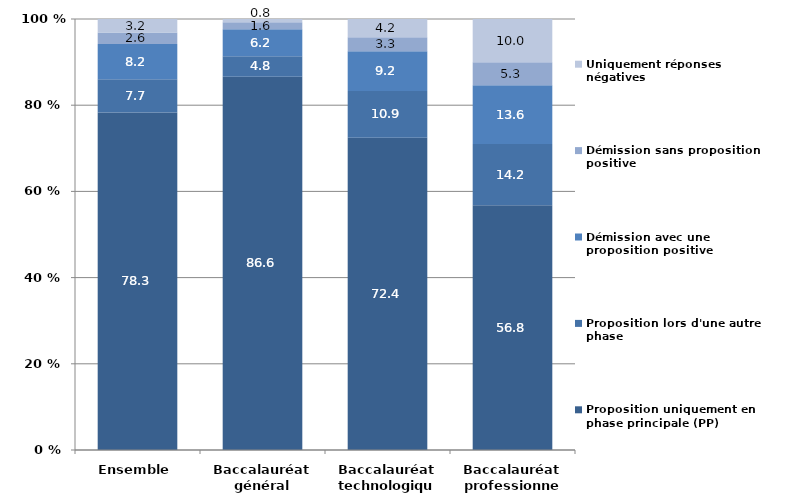
| Category | Proposition uniquement en phase principale (PP) | Proposition lors d'une autre phase | Démission avec une proposition positive | Démission sans proposition positive | Uniquement réponses négatives |
|---|---|---|---|---|---|
| Ensemble | 78.304 | 7.74 | 8.178 | 2.626 | 3.153 |
| Baccalauréat général | 86.616 | 4.764 | 6.235 | 1.605 | 0.779 |
| Baccalauréat technologique | 72.433 | 10.873 | 9.2 | 3.281 | 4.214 |
| Baccalauréat professionnel | 56.804 | 14.171 | 13.633 | 5.346 | 10.047 |